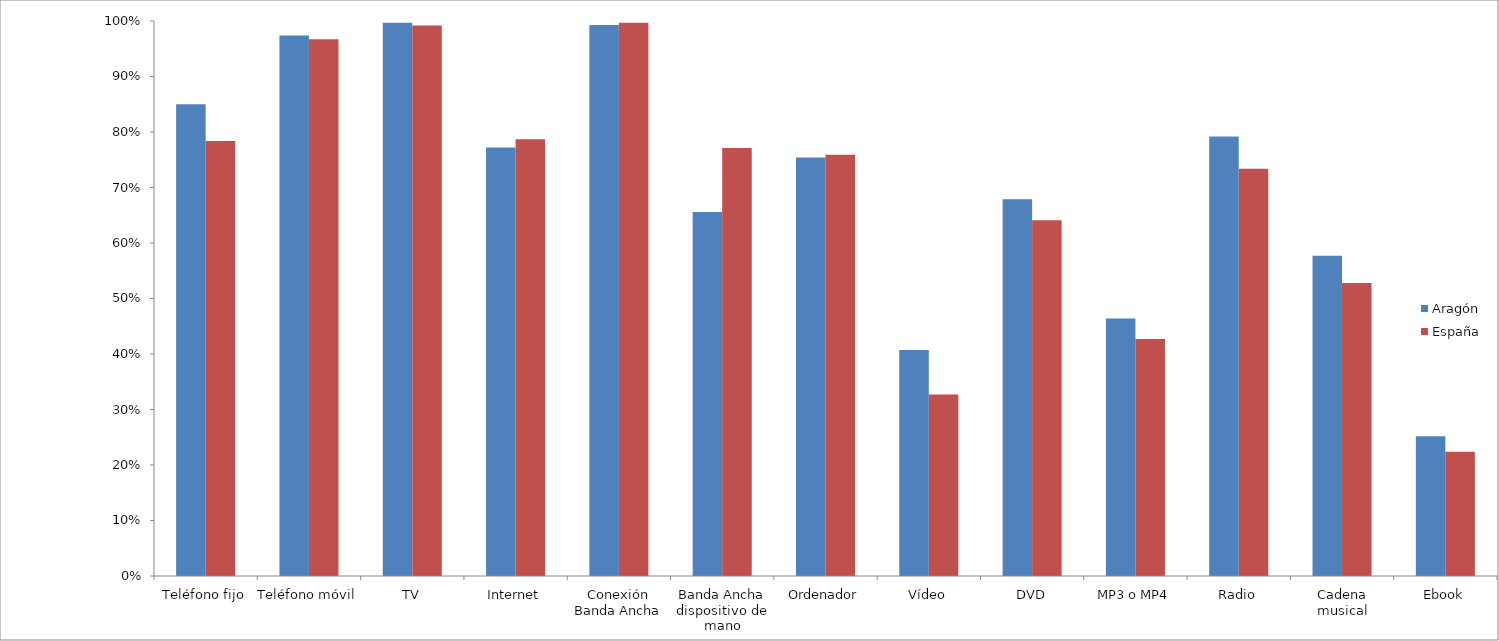
| Category | Aragón | España |
|---|---|---|
| Teléfono fijo | 0.85 | 0.784 |
| Teléfono móvil | 0.974 | 0.967 |
| TV | 0.997 | 0.992 |
| Internet | 0.772 | 0.787 |
| Conexión Banda Ancha | 0.993 | 0.997 |
| Banda Ancha dispositivo de mano | 0.656 | 0.771 |
| Ordenador | 0.754 | 0.759 |
| Vídeo | 0.407 | 0.327 |
| DVD | 0.679 | 0.641 |
| MP3 o MP4 | 0.464 | 0.427 |
| Radio | 0.792 | 0.734 |
| Cadena musical | 0.577 | 0.528 |
| Ebook | 0.252 | 0.224 |